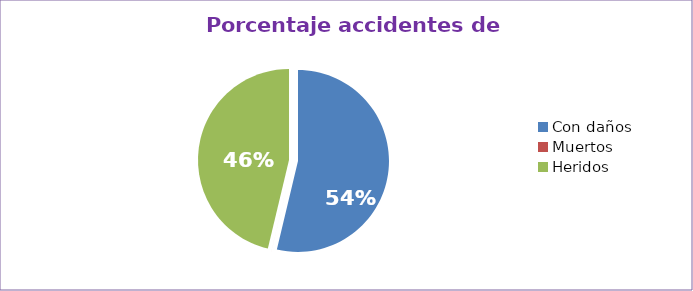
| Category | Series 0 |
|---|---|
| Con daños  | 53.731 |
| Muertos  | 0 |
| Heridos  | 46.269 |